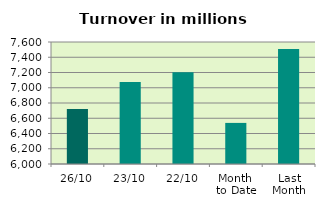
| Category | Series 0 |
|---|---|
| 26/10 | 6721.491 |
| 23/10 | 7074.551 |
| 22/10 | 7202.051 |
| Month 
to Date | 6538.895 |
| Last
Month | 7507.246 |